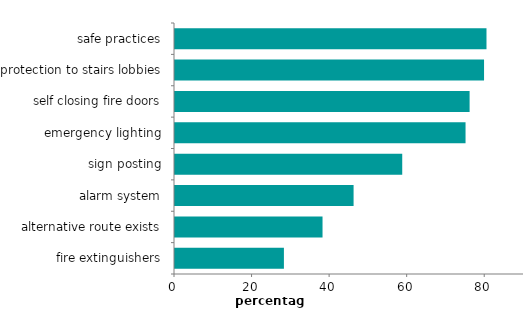
| Category | Series 0 |
|---|---|
| fire extinguishers | 28.086 |
| alternative route exists | 38.045 |
| alarm system | 46.053 |
| sign posting | 58.599 |
| emergency lighting | 74.924 |
| self closing fire doors | 75.973 |
| protection to stairs lobbies | 79.697 |
| safe practices | 80.327 |